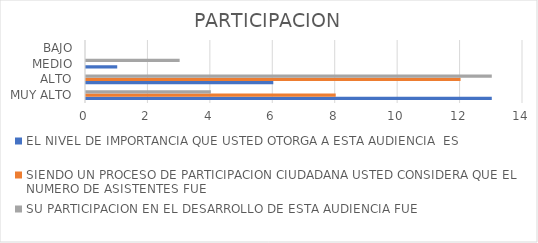
| Category | EL NIVEL DE IMPORTANCIA QUE USTED OTORGA A ESTA AUDIENCIA  ES | SIENDO UN PROCESO DE PARTICIPACION CIUDADANA USTED CONSIDERA QUE EL NUMERO DE ASISTENTES FUE | SU PARTICIPACION EN EL DESARROLLO DE ESTA AUDIENCIA FUE |
|---|---|---|---|
| MUY ALTO | 13 | 8 | 4 |
| ALTO | 6 | 12 | 13 |
| MEDIO | 1 | 0 | 3 |
| BAJO | 0 | 0 | 0 |